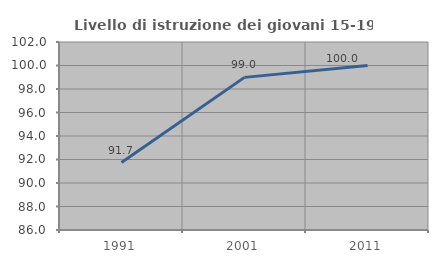
| Category | Livello di istruzione dei giovani 15-19 anni |
|---|---|
| 1991.0 | 91.736 |
| 2001.0 | 98.99 |
| 2011.0 | 100 |